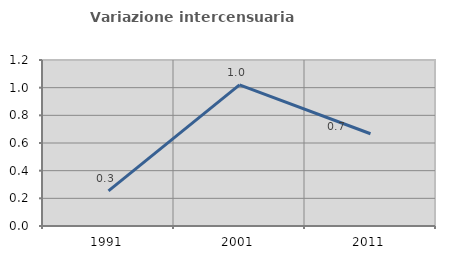
| Category | Variazione intercensuaria annua |
|---|---|
| 1991.0 | 0.253 |
| 2001.0 | 1.02 |
| 2011.0 | 0.667 |